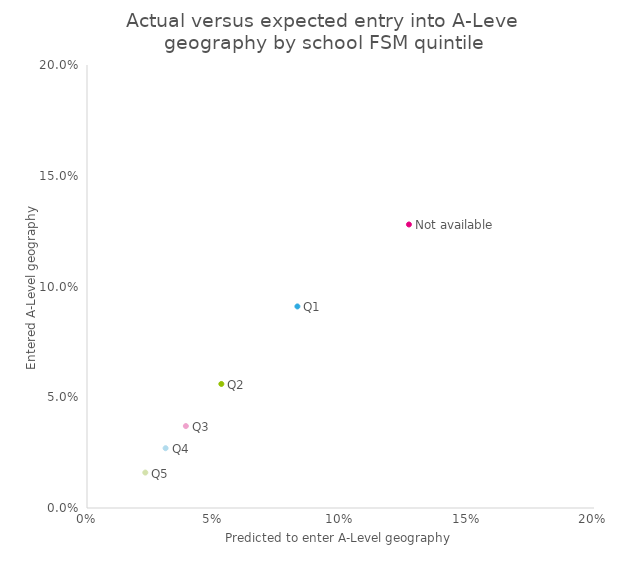
| Category | Series 0 |
|---|---|
| 0.127 | 0.128 |
| 0.083 | 0.091 |
| 0.053 | 0.056 |
| 0.039 | 0.037 |
| 0.031 | 0.027 |
| 0.023 | 0.016 |